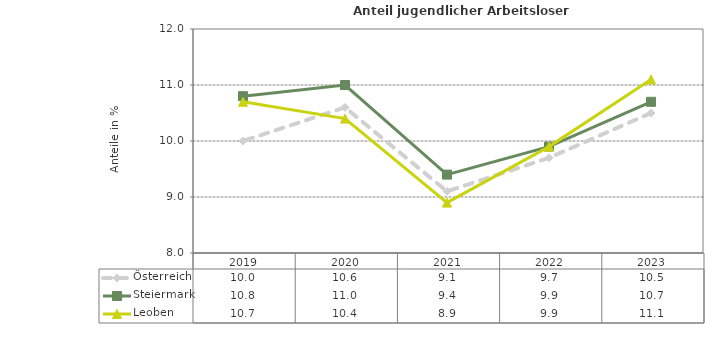
| Category | Österreich | Steiermark | Leoben |
|---|---|---|---|
| 2023.0 | 10.5 | 10.7 | 11.1 |
| 2022.0 | 9.7 | 9.9 | 9.9 |
| 2021.0 | 9.1 | 9.4 | 8.9 |
| 2020.0 | 10.6 | 11 | 10.4 |
| 2019.0 | 10 | 10.8 | 10.7 |